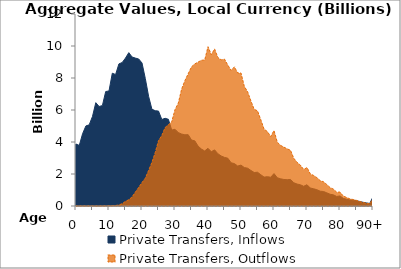
| Category | Private Transfers, Inflows | Private Transfers, Outflows |
|---|---|---|
| 0 | 3872.87 | 0 |
|  | 3787.881 | 0 |
| 2 | 4519.856 | 0 |
| 3 | 5002.955 | 0 |
| 4 | 5071.654 | 0 |
| 5 | 5601.144 | 0 |
| 6 | 6457.478 | 0 |
| 7 | 6220.452 | 0 |
| 8 | 6275.86 | 0.963 |
| 9 | 7153.027 | 5.59 |
| 10 | 7191.634 | 9.34 |
| 11 | 8298.995 | 12.758 |
| 12 | 8217.442 | 30.564 |
| 13 | 8880.628 | 63.898 |
| 14 | 8968.308 | 144.13 |
| 15 | 9247.519 | 292.666 |
| 16 | 9584.247 | 389.936 |
| 17 | 9311.457 | 571.451 |
| 18 | 9244.691 | 867.802 |
| 19 | 9187.502 | 1161.44 |
| 20 | 8939.236 | 1468.259 |
| 21 | 7970.087 | 1738.258 |
| 22 | 6854.157 | 2222.365 |
| 23 | 6051.227 | 2720.736 |
| 24 | 5955.992 | 3337.559 |
| 25 | 5934.323 | 4084.574 |
| 26 | 5405.742 | 4407.151 |
| 27 | 5481.915 | 4901.486 |
| 28 | 5421.328 | 5085.538 |
| 29 | 4744.723 | 5257.196 |
| 30 | 4796.24 | 6021.599 |
| 31 | 4590.003 | 6430.019 |
| 32 | 4497.543 | 7298.539 |
| 33 | 4451 | 7835.885 |
| 34 | 4457.79 | 8266.554 |
| 35 | 4123.344 | 8696.306 |
| 36 | 4072.308 | 8879.009 |
| 37 | 3742.718 | 8993.458 |
| 38 | 3559.534 | 9108.946 |
| 39 | 3439.18 | 9119.727 |
| 40 | 3606.706 | 9956.456 |
| 41 | 3391.689 | 9458.418 |
| 42 | 3509.104 | 9814.489 |
| 43 | 3265.973 | 9277.509 |
| 44 | 3127.317 | 9133.89 |
| 45 | 3037.715 | 9179.307 |
| 46 | 2988.325 | 8807.077 |
| 47 | 2700.577 | 8479.396 |
| 48 | 2650.899 | 8695.228 |
| 49 | 2498.001 | 8313.934 |
| 50 | 2557.448 | 8313.535 |
| 51 | 2402.545 | 7476.579 |
| 52 | 2364.126 | 7146.237 |
| 53 | 2223.373 | 6565.631 |
| 54 | 2092.711 | 6039.973 |
| 55 | 2110.563 | 5949.503 |
| 56 | 1955.158 | 5389.877 |
| 57 | 1806.368 | 4804.098 |
| 58 | 1831.734 | 4649.679 |
| 59 | 1797.391 | 4342.011 |
| 60 | 2025.534 | 4716.207 |
| 61 | 1765.2 | 3987.298 |
| 62 | 1700.762 | 3789.023 |
| 63 | 1656.614 | 3679.195 |
| 64 | 1642.626 | 3571.76 |
| 65 | 1658.552 | 3483.352 |
| 66 | 1453.06 | 2980.945 |
| 67 | 1371.883 | 2726.409 |
| 68 | 1326.556 | 2554.355 |
| 69 | 1232.798 | 2278.013 |
| 70 | 1328.265 | 2404.809 |
| 71 | 1122.642 | 2008.445 |
| 72 | 1078.695 | 1908.7 |
| 73 | 1016.96 | 1770.898 |
| 74 | 925.89 | 1584.77 |
| 75 | 905.316 | 1516.016 |
| 76 | 823.884 | 1341.309 |
| 77 | 734.128 | 1152.817 |
| 78 | 698.912 | 1053.748 |
| 79 | 596.23 | 861.98 |
| 80 | 630.824 | 871.367 |
| 81 | 473.651 | 622.537 |
| 82 | 426.2 | 531.088 |
| 83 | 378.062 | 446.171 |
| 84 | 362.522 | 404.994 |
| 85 | 334.208 | 352.091 |
| 86 | 279.988 | 278.594 |
| 87 | 231.311 | 217.507 |
| 88 | 192.99 | 171.604 |
| 89 | 156.995 | 132.058 |
| 90+ | 568.031 | 451.924 |